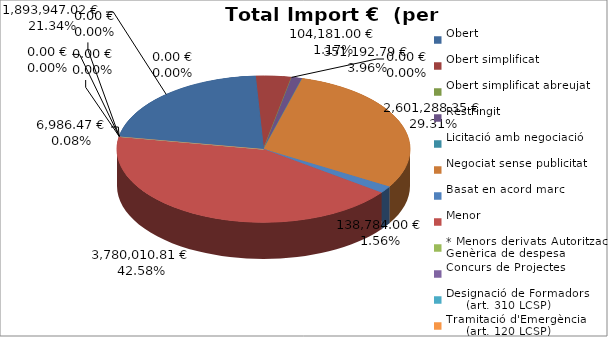
| Category | Total preu
(amb IVA) |
|---|---|
| Obert | 1893947.02 |
| Obert simplificat | 351192.79 |
| Obert simplificat abreujat | 0 |
| Restringit | 104181 |
| Licitació amb negociació | 0 |
| Negociat sense publicitat | 2601288.35 |
| Basat en acord marc | 138784 |
| Menor | 3780010.81 |
| * Menors derivats Autorització Genèrica de despesa | 6986.47 |
| Concurs de Projectes | 0 |
| Designació de Formadors
     (art. 310 LCSP) | 0 |
| Tramitació d'Emergència
     (art. 120 LCSP) | 0 |